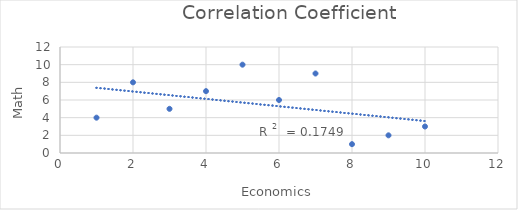
| Category | Reconomics |
|---|---|
| 10.0 | 3 |
| 8.0 | 1 |
| 2.0 | 8 |
| 3.0 | 5 |
| 6.0 | 6 |
| 4.0 | 7 |
| 1.0 | 4 |
| 9.0 | 2 |
| 7.0 | 9 |
| 5.0 | 10 |